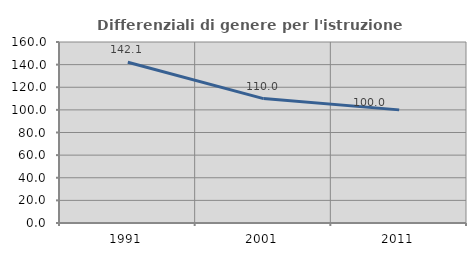
| Category | Differenziali di genere per l'istruzione superiore |
|---|---|
| 1991.0 | 142.105 |
| 2001.0 | 109.975 |
| 2011.0 | 100 |